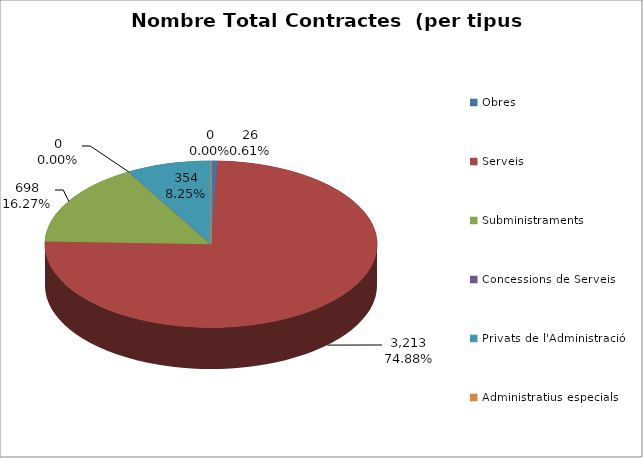
| Category | Nombre Total Contractes |
|---|---|
| Obres | 26 |
| Serveis | 3213 |
| Subministraments | 698 |
| Concessions de Serveis | 0 |
| Privats de l'Administració | 354 |
| Administratius especials | 0 |